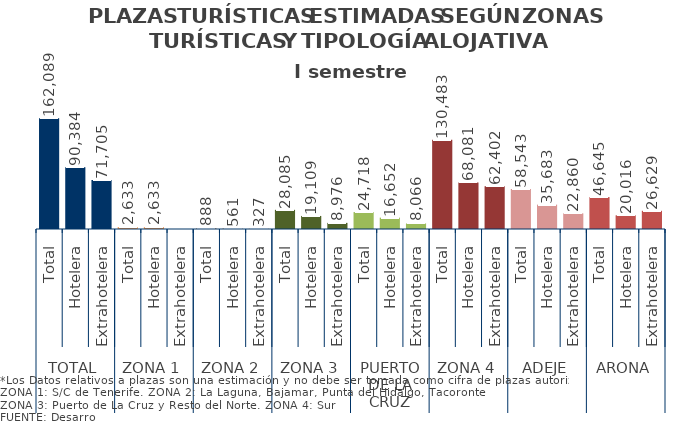
| Category | I semestre 2014 |
|---|---|
| 0 | 162089 |
| 1 | 90384 |
| 2 | 71705 |
| 3 | 2633 |
| 4 | 2633 |
| 5 | 0 |
| 6 | 888 |
| 7 | 561 |
| 8 | 327 |
| 9 | 28085 |
| 10 | 19109 |
| 11 | 8976 |
| 12 | 24718 |
| 13 | 16652 |
| 14 | 8066 |
| 15 | 130483 |
| 16 | 68081 |
| 17 | 62402 |
| 18 | 58543 |
| 19 | 35683 |
| 20 | 22860 |
| 21 | 46645 |
| 22 | 20016 |
| 23 | 26629 |